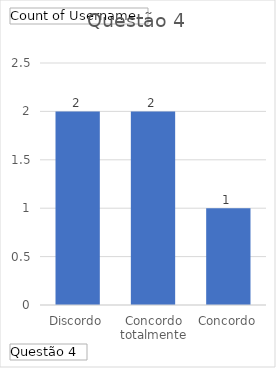
| Category | Total |
|---|---|
| Discordo | 2 |
| Concordo totalmente | 2 |
| Concordo | 1 |